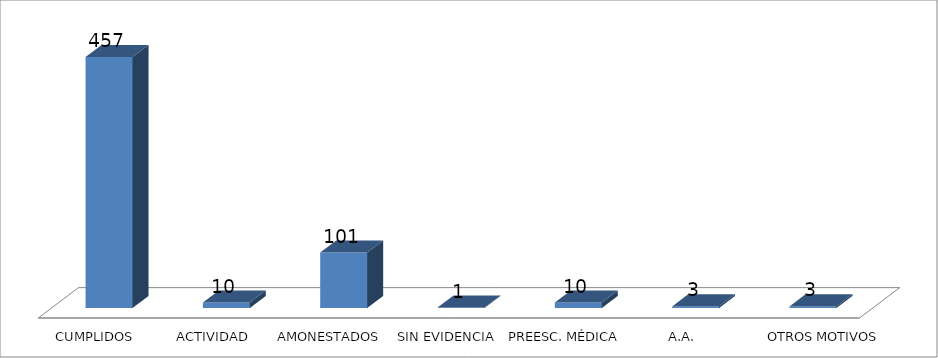
| Category | Series 0 |
|---|---|
| CUMPLIDOS | 457 |
| ACTIVIDAD | 10 |
| AMONESTADOS | 101 |
| SIN EVIDENCIA | 1 |
| PREESC. MÉDICA | 10 |
| A.A. | 3 |
| OTROS MOTIVOS | 3 |